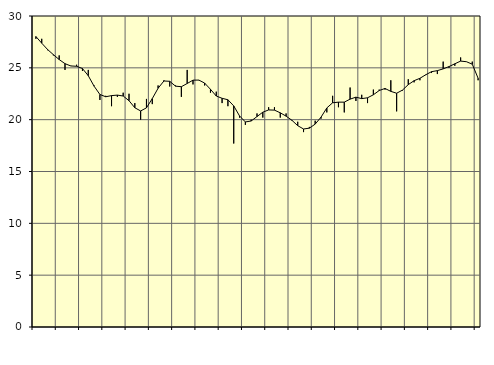
| Category | Piggar | Series 1 |
|---|---|---|
| nan | 27.8 | 28.02 |
| 1.0 | 27.8 | 27.38 |
| 1.0 | 26.7 | 26.77 |
| 1.0 | 26.2 | 26.27 |
| nan | 26.2 | 25.8 |
| 2.0 | 24.8 | 25.4 |
| 2.0 | 25.2 | 25.18 |
| 2.0 | 25.3 | 25.15 |
| nan | 24.7 | 24.93 |
| 3.0 | 24.8 | 24.24 |
| 3.0 | 23.3 | 23.23 |
| 3.0 | 21.9 | 22.43 |
| nan | 22.3 | 22.21 |
| 4.0 | 21.3 | 22.32 |
| 4.0 | 22.2 | 22.37 |
| 4.0 | 22.6 | 22.28 |
| nan | 22.5 | 21.83 |
| 5.0 | 21.6 | 21.15 |
| 5.0 | 20 | 20.84 |
| 5.0 | 22 | 21.14 |
| nan | 21.5 | 22.03 |
| 6.0 | 23.3 | 23.03 |
| 6.0 | 23.8 | 23.73 |
| 6.0 | 23.2 | 23.7 |
| nan | 23.3 | 23.23 |
| 7.0 | 22.2 | 23.18 |
| 7.0 | 24.8 | 23.49 |
| 7.0 | 23.4 | 23.81 |
| nan | 23.8 | 23.82 |
| 8.0 | 23.3 | 23.53 |
| 8.0 | 22.6 | 22.93 |
| 8.0 | 22.7 | 22.28 |
| nan | 21.6 | 22.06 |
| 9.0 | 21.3 | 21.92 |
| 9.0 | 17.7 | 21.33 |
| 9.0 | 20.2 | 20.36 |
| nan | 19.5 | 19.78 |
| 10.0 | 20 | 19.87 |
| 10.0 | 20.6 | 20.3 |
| 10.0 | 20.2 | 20.72 |
| nan | 21.2 | 20.94 |
| 11.0 | 21.2 | 20.92 |
| 11.0 | 20.2 | 20.66 |
| 11.0 | 20.6 | 20.34 |
| nan | 19.9 | 19.94 |
| 12.0 | 19.8 | 19.42 |
| 12.0 | 18.8 | 19.1 |
| 12.0 | 19.3 | 19.18 |
| nan | 19.9 | 19.57 |
| 13.0 | 20.1 | 20.24 |
| 13.0 | 20.7 | 21.13 |
| 13.0 | 22.3 | 21.63 |
| nan | 21.2 | 21.69 |
| 14.0 | 20.7 | 21.69 |
| 14.0 | 23.1 | 21.98 |
| 14.0 | 21.8 | 22.17 |
| nan | 22.4 | 22.03 |
| 15.0 | 21.6 | 22.11 |
| 15.0 | 22.9 | 22.4 |
| 15.0 | 22.9 | 22.81 |
| nan | 22.9 | 23.01 |
| 16.0 | 23.8 | 22.73 |
| 16.0 | 20.8 | 22.55 |
| 16.0 | 22.8 | 22.85 |
| nan | 23.9 | 23.38 |
| 17.0 | 23.6 | 23.76 |
| 17.0 | 23.8 | 23.99 |
| 17.0 | 24.3 | 24.33 |
| nan | 24.5 | 24.63 |
| 18.0 | 24.4 | 24.73 |
| 18.0 | 25.6 | 24.9 |
| 18.0 | 25 | 25.12 |
| nan | 25.2 | 25.39 |
| 19.0 | 26 | 25.65 |
| 19.0 | 25.6 | 25.59 |
| 19.0 | 25.6 | 25.35 |
| nan | 23.8 | 24 |